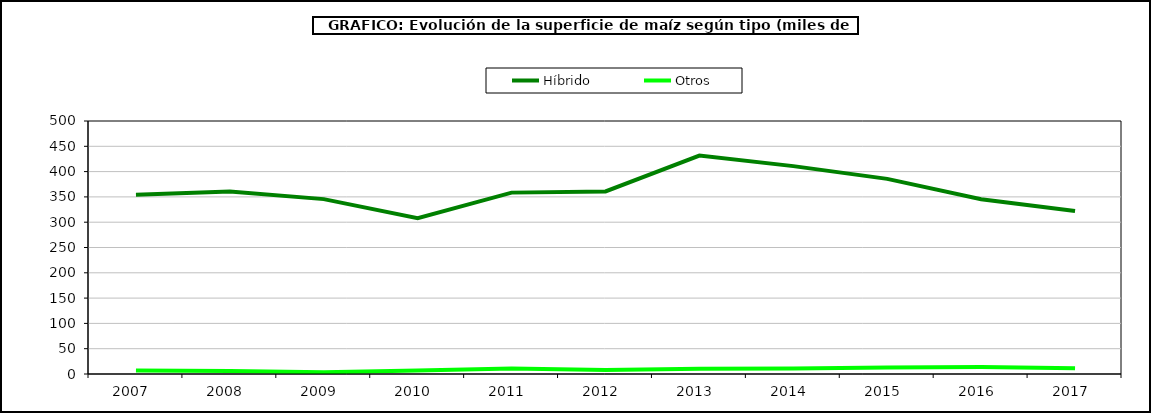
| Category | Híbrido | Otros |
|---|---|---|
| 2007.0 | 354.133 | 6.865 |
| 2008.0 | 360.764 | 5.72 |
| 2009.0 | 345.605 | 3.344 |
| 2010.0 | 307.927 | 7.063 |
| 2011.0 | 358.45 | 10.814 |
| 2012.0 | 360.837 | 7.917 |
| 2013.0 | 431.742 | 10.556 |
| 2014.0 | 410.83 | 10.775 |
| 2015.0 | 385.617 | 12.64 |
| 2016.0 | 345.266 | 14.009 |
| 2017.0 | 322.341 | 11.287 |